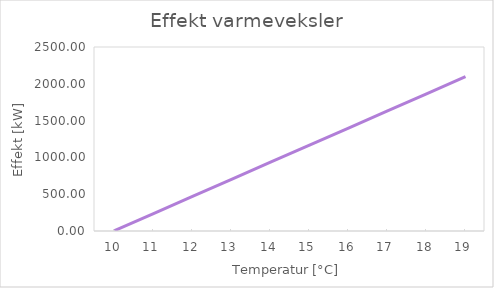
| Category | Series 0 |
|---|---|
| 10.0 | 4.85 |
| 11.0 | 237.257 |
| 12.0 | 469.665 |
| 13.0 | 702.072 |
| 14.0 | 934.48 |
| 15.0 | 1166.887 |
| 16.0 | 1399.294 |
| 17.0 | 1631.702 |
| 18.0 | 1864.109 |
| 19.0 | 2096.517 |